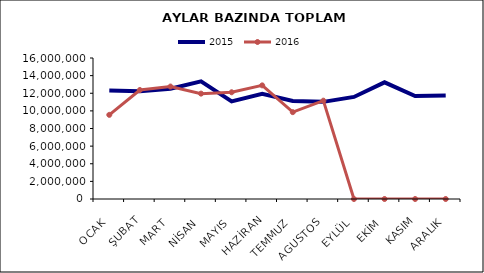
| Category | 2015 | 2016 |
|---|---|---|
| OCAK | 12301766.75 | 9548480.687 |
| ŞUBAT | 12231860.14 | 12368484.651 |
| MART | 12519910.438 | 12760741.637 |
| NİSAN | 13349346.866 | 11957227.112 |
| MAYIS | 11080385.127 | 12110893.315 |
| HAZİRAN | 11949647.086 | 12893841.158 |
| TEMMUZ | 11129358.974 | 9855005.219 |
| AGUSTOS | 11022045.344 | 11157251.497 |
| EYLÜL | 11581703.842 | 0 |
| EKİM | 13240039.088 | 0 |
| KASIM | 11681989.013 | 0 |
| ARALIK | 11750818.76 | 0 |